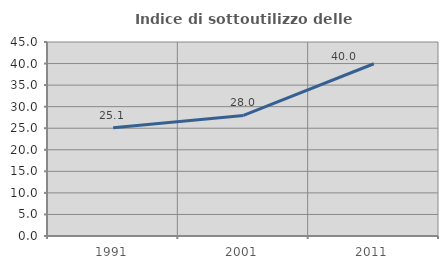
| Category | Indice di sottoutilizzo delle abitazioni  |
|---|---|
| 1991.0 | 25.123 |
| 2001.0 | 27.968 |
| 2011.0 | 39.955 |